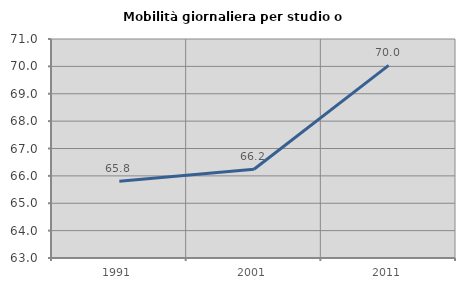
| Category | Mobilità giornaliera per studio o lavoro |
|---|---|
| 1991.0 | 65.806 |
| 2001.0 | 66.243 |
| 2011.0 | 70.037 |